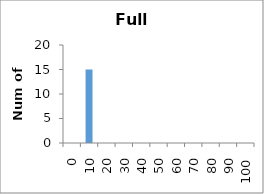
| Category | Frequency |
|---|---|
| 0.0 | 0 |
| 10.0 | 15 |
| 20.0 | 0 |
| 30.0 | 0 |
| 40.0 | 0 |
| 50.0 | 0 |
| 60.0 | 0 |
| 70.0 | 0 |
| 80.0 | 0 |
| 90.0 | 0 |
| 100.0 | 0 |